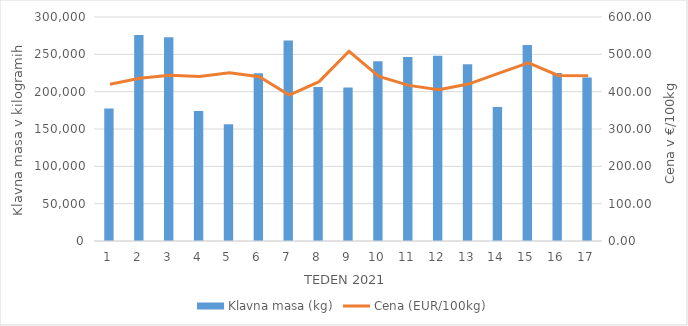
| Category | Klavna masa (kg) |
|---|---|
| 1.0 | 177573 |
| 2.0 | 275951 |
| 3.0 | 272797 |
| 4.0 | 174056 |
| 5.0 | 156508 |
| 6.0 | 224595 |
| 7.0 | 268436 |
| 8.0 | 206193 |
| 9.0 | 205669 |
| 10.0 | 240592 |
| 11.0 | 246325 |
| 12.0 | 248020 |
| 13.0 | 236703 |
| 14.0 | 179478 |
| 15.0 | 262544 |
| 16.0 | 225033 |
| 17.0 | 218950 |